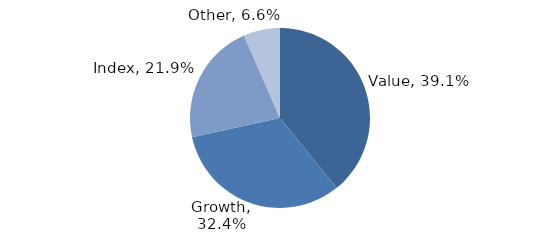
| Category | Investment Style |
|---|---|
| Value | 0.391 |
| Growth | 0.324 |
| Index | 0.219 |
| Other | 0.066 |